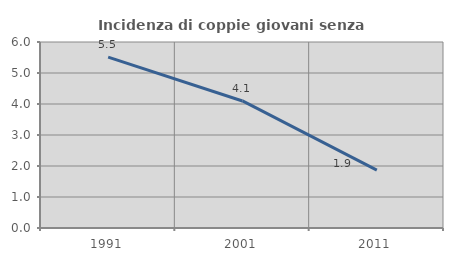
| Category | Incidenza di coppie giovani senza figli |
|---|---|
| 1991.0 | 5.512 |
| 2001.0 | 4.098 |
| 2011.0 | 1.869 |